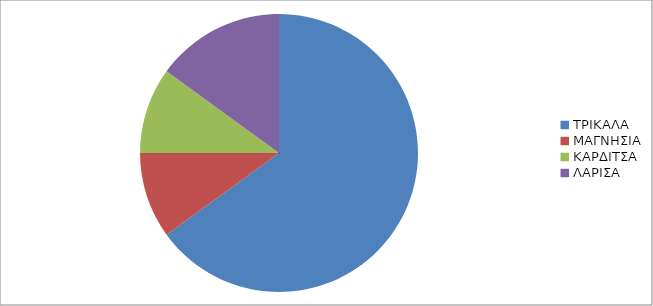
| Category | Series 0 |
|---|---|
| ΤΡΙΚΑΛΑ | 13 |
| ΜΑΓΝΗΣΙΑ | 2 |
| ΚΑΡΔΙΤΣΑ | 2 |
| ΛΑΡΙΣΑ | 3 |